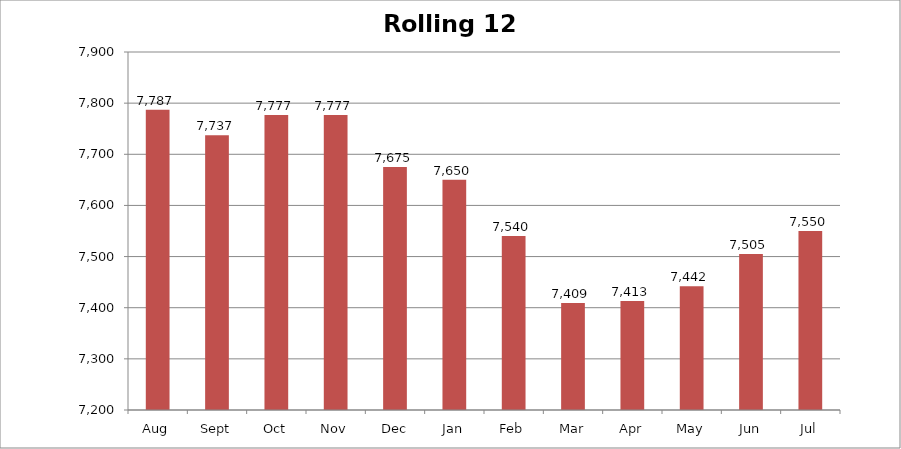
| Category | Rolling 12 Month |
|---|---|
| Aug | 7787 |
| Sept | 7737 |
| Oct | 7777 |
| Nov | 7777 |
| Dec | 7675 |
| Jan | 7650 |
| Feb | 7540 |
| Mar | 7409 |
| Apr | 7413 |
| May | 7442 |
| Jun | 7505 |
| Jul | 7550 |